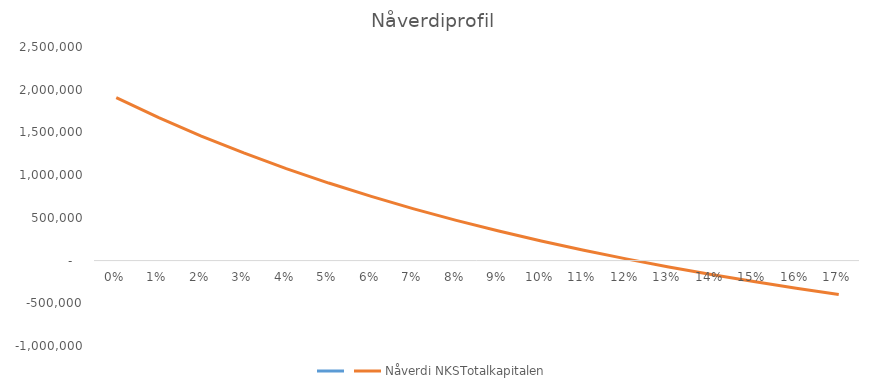
| Category | Series 0 | Nåverdi NKSTotalkapitalen |
|---|---|---|
| 0.0 |  | 1906599.558 |
| 0.01 |  | 1672925.218 |
| 0.02 |  | 1457839.917 |
| 0.03 |  | 1259581.007 |
| 0.04 |  | 1076574.294 |
| 0.05 |  | 907411.9 |
| 0.06 |  | 750832.944 |
| 0.07 |  | 605706.655 |
| 0.08 |  | 471017.575 |
| 0.09 |  | 345852.601 |
| 0.1 |  | 229389.594 |
| 0.11 |  | 120887.368 |
| 0.12 |  | 19676.879 |
| 0.13 |  | -74846.554 |
| 0.14 |  | -163230.102 |
| 0.15 |  | -245969.502 |
| 0.16 |  | -323514.417 |
| 0.17 |  | -396273.202 |